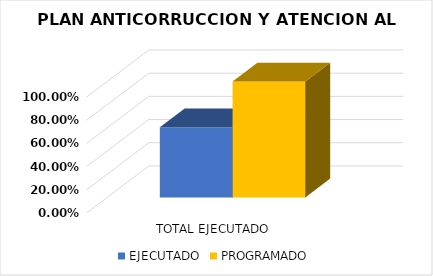
| Category | EJECUTADO | PROGRAMADO |
|---|---|---|
| TOTAL EJECUTADO | 0.605 | 1 |